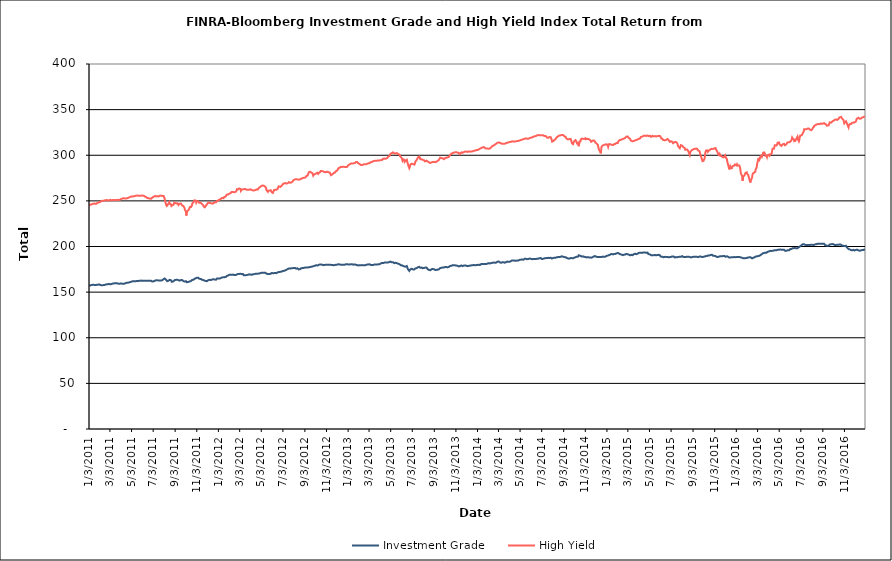
| Category | Investment Grade | High Yield |
|---|---|---|
| 1/3/11 | 157.626 | 244.716 |
| 1/4/11 | 157.815 | 245.187 |
| 1/5/11 | 157.257 | 245.618 |
| 1/6/11 | 157.308 | 245.993 |
| 1/7/11 | 157.728 | 245.896 |
| 1/10/11 | 157.85 | 246.09 |
| 1/11/11 | 157.862 | 246.402 |
| 1/12/11 | 157.794 | 246.55 |
| 1/13/11 | 158.013 | 246.81 |
| 1/14/11 | 158.143 | 246.922 |
| 1/18/11 | 157.91 | 247.078 |
| 1/19/11 | 158.148 | 247.099 |
| 1/20/11 | 157.779 | 246.707 |
| 1/21/11 | 157.772 | 246.716 |
| 1/24/11 | 157.98 | 246.961 |
| 1/25/11 | 158.258 | 247.578 |
| 1/26/11 | 158.002 | 247.765 |
| 1/27/11 | 158.085 | 248.289 |
| 1/28/11 | 158.333 | 247.918 |
| 1/31/11 | 158.463 | 248.319 |
| 2/1/11 | 158.167 | 248.646 |
| 2/2/11 | 158.091 | 248.934 |
| 2/3/11 | 157.788 | 248.813 |
| 2/4/11 | 157.483 | 249.293 |
| 2/7/11 | 157.584 | 249.856 |
| 2/8/11 | 157.563 | 250.164 |
| 2/9/11 | 157.528 | 250.282 |
| 2/10/11 | 157.543 | 250.22 |
| 2/11/11 | 157.651 | 250.083 |
| 2/14/11 | 157.832 | 250.194 |
| 2/15/11 | 157.905 | 250.283 |
| 2/16/11 | 157.966 | 250.519 |
| 2/17/11 | 158.084 | 250.733 |
| 2/18/11 | 158.064 | 250.911 |
| 2/22/11 | 158.645 | 250.896 |
| 2/23/11 | 158.66 | 250.602 |
| 2/24/11 | 158.475 | 250.152 |
| 2/25/11 | 158.728 | 250.286 |
| 2/28/11 | 159 | 250.537 |
| 3/1/11 | 159.151 | 250.931 |
| 3/2/11 | 159.145 | 251.083 |
| 3/3/11 | 158.534 | 251.151 |
| 3/4/11 | 158.722 | 250.995 |
| 3/7/11 | 158.888 | 250.721 |
| 3/8/11 | 158.73 | 251.313 |
| 3/9/11 | 158.992 | 251.345 |
| 3/10/11 | 159.281 | 250.84 |
| 3/11/11 | 159.453 | 250.74 |
| 3/14/11 | 159.639 | 250.996 |
| 3/15/11 | 159.696 | 250.261 |
| 3/16/11 | 160.006 | 250.243 |
| 3/17/11 | 159.744 | 250.739 |
| 3/18/11 | 159.878 | 251.393 |
| 3/21/11 | 159.836 | 251.043 |
| 3/22/11 | 159.827 | 251.203 |
| 3/23/11 | 159.71 | 250.998 |
| 3/24/11 | 159.495 | 251.104 |
| 3/25/11 | 159.317 | 250.991 |
| 3/28/11 | 159.199 | 251.006 |
| 3/29/11 | 159.016 | 251.066 |
| 3/30/11 | 159.023 | 251.431 |
| 3/31/11 | 159.304 | 251.272 |
| 4/1/11 | 159.072 | 251.92 |
| 4/4/11 | 159.53 | 252.238 |
| 4/5/11 | 159.285 | 252.698 |
| 4/6/11 | 159.11 | 252.56 |
| 4/7/11 | 159.049 | 252.574 |
| 4/8/11 | 159.041 | 252.811 |
| 4/11/11 | 159.06 | 252.995 |
| 4/12/11 | 159.391 | 252.709 |
| 4/13/11 | 159.584 | 252.682 |
| 4/14/11 | 159.56 | 252.554 |
| 4/15/11 | 159.954 | 252.893 |
| 4/18/11 | 160.215 | 252.622 |
| 4/19/11 | 160.381 | 252.671 |
| 4/20/11 | 160.362 | 252.88 |
| 4/21/11 | 160.327 | 253.09 |
| 4/25/11 | 160.449 | 253.534 |
| 4/26/11 | 160.774 | 253.773 |
| 4/27/11 | 160.593 | 253.724 |
| 4/28/11 | 160.972 | 254.275 |
| 4/29/11 | 161.184 | 254.364 |
| 5/2/11 | 161.378 | 254.711 |
| 5/3/11 | 161.544 | 254.53 |
| 5/4/11 | 161.69 | 254.875 |
| 5/5/11 | 161.863 | 254.808 |
| 5/6/11 | 161.867 | 255.155 |
| 5/9/11 | 162.019 | 255.013 |
| 5/10/11 | 161.844 | 255.551 |
| 5/11/11 | 161.91 | 255.621 |
| 5/12/11 | 161.919 | 255.348 |
| 5/13/11 | 162.003 | 255.328 |
| 5/16/11 | 162.092 | 255.735 |
| 5/17/11 | 162.436 | 255.698 |
| 5/18/11 | 162.239 | 255.708 |
| 5/19/11 | 162.04 | 255.887 |
| 5/20/11 | 162.161 | 255.759 |
| 5/23/11 | 162.38 | 255.548 |
| 5/24/11 | 162.266 | 255.706 |
| 5/25/11 | 162.212 | 255.594 |
| 5/26/11 | 162.355 | 255.674 |
| 5/27/11 | 162.427 | 256.036 |
| 5/31/11 | 162.634 | 255.76 |
| 6/1/11 | 162.928 | 255.849 |
| 6/2/11 | 162.566 | 255.591 |
| 6/3/11 | 162.489 | 255.756 |
| 6/6/11 | 162.453 | 255.667 |
| 6/7/11 | 162.401 | 255.356 |
| 6/8/11 | 162.584 | 254.91 |
| 6/9/11 | 162.504 | 254.704 |
| 6/10/11 | 162.479 | 254.634 |
| 6/13/11 | 162.452 | 254.118 |
| 6/14/11 | 162.032 | 253.948 |
| 6/15/11 | 162.272 | 253.687 |
| 6/16/11 | 162.422 | 253.138 |
| 6/17/11 | 162.412 | 253.373 |
| 6/20/11 | 162.37 | 252.794 |
| 6/21/11 | 162.429 | 252.839 |
| 6/22/11 | 162.449 | 253.214 |
| 6/23/11 | 162.527 | 252.527 |
| 6/24/11 | 162.699 | 252.693 |
| 6/27/11 | 162.361 | 252.368 |
| 6/28/11 | 161.852 | 253.028 |
| 6/29/11 | 161.652 | 253.4 |
| 6/30/11 | 161.582 | 253.619 |
| 7/1/11 | 161.664 | 254.51 |
| 7/5/11 | 162.021 | 254.798 |
| 7/6/11 | 162.135 | 255.008 |
| 7/7/11 | 161.984 | 255.276 |
| 7/8/11 | 162.646 | 255.417 |
| 7/11/11 | 162.928 | 254.826 |
| 7/12/11 | 163.078 | 254.68 |
| 7/13/11 | 163.147 | 255.054 |
| 7/14/11 | 162.932 | 255.182 |
| 7/15/11 | 162.894 | 254.981 |
| 7/18/11 | 162.779 | 254.861 |
| 7/19/11 | 162.716 | 254.905 |
| 7/20/11 | 162.937 | 255.359 |
| 7/21/11 | 162.64 | 255.583 |
| 7/22/11 | 162.835 | 255.706 |
| 7/25/11 | 162.739 | 255.818 |
| 7/26/11 | 162.87 | 256.239 |
| 7/27/11 | 162.9 | 255.731 |
| 7/28/11 | 162.985 | 255.399 |
| 7/29/11 | 163.627 | 255.056 |
| 8/1/11 | 164.219 | 255.393 |
| 8/2/11 | 164.63 | 254.416 |
| 8/3/11 | 164.773 | 253.433 |
| 8/4/11 | 164.945 | 252.108 |
| 8/5/11 | 164.443 | 251.097 |
| 8/8/11 | 163.395 | 245.602 |
| 8/9/11 | 163.141 | 244.507 |
| 8/10/11 | 163.204 | 244.486 |
| 8/11/11 | 161.985 | 243.45 |
| 8/12/11 | 162.398 | 245.222 |
| 8/15/11 | 162.572 | 247.051 |
| 8/16/11 | 162.936 | 247.363 |
| 8/17/11 | 163.319 | 248.419 |
| 8/18/11 | 163.44 | 246.821 |
| 8/19/11 | 163.205 | 246.281 |
| 8/22/11 | 162.937 | 246.179 |
| 8/23/11 | 162.18 | 244.365 |
| 8/24/11 | 161.334 | 243.738 |
| 8/25/11 | 161.636 | 244.871 |
| 8/26/11 | 161.888 | 245.33 |
| 8/29/11 | 161.931 | 245.795 |
| 8/30/11 | 162.637 | 246.122 |
| 8/31/11 | 162.878 | 248.155 |
| 9/1/11 | 163.171 | 248.397 |
| 9/2/11 | 163.433 | 248.749 |
| 9/6/11 | 163.525 | 247.181 |
| 9/7/11 | 163.501 | 247.704 |
| 9/8/11 | 163.55 | 247.68 |
| 9/9/11 | 163.455 | 247.331 |
| 9/12/11 | 163.134 | 245.486 |
| 9/13/11 | 162.81 | 245.818 |
| 9/14/11 | 162.872 | 246.767 |
| 9/15/11 | 162.604 | 247.229 |
| 9/16/11 | 162.758 | 247.457 |
| 9/19/11 | 163.176 | 247.147 |
| 9/20/11 | 163.198 | 247.421 |
| 9/21/11 | 163.313 | 247.136 |
| 9/22/11 | 163.267 | 245.042 |
| 9/23/11 | 162.556 | 244.18 |
| 9/26/11 | 162.073 | 244.218 |
| 9/27/11 | 161.715 | 244.546 |
| 9/28/11 | 161.525 | 243.141 |
| 9/29/11 | 161.625 | 242.219 |
| 9/30/11 | 161.689 | 240.219 |
| 10/3/11 | 162.004 | 238.38 |
| 10/4/11 | 161.143 | 233.908 |
| 10/5/11 | 160.886 | 235.671 |
| 10/6/11 | 160.951 | 238.602 |
| 10/7/11 | 160.961 | 239.592 |
| 10/10/11 | 161.166 | 239.899 |
| 10/11/11 | 160.928 | 238.887 |
| 10/12/11 | 161.23 | 241 |
| 10/13/11 | 161.659 | 241.617 |
| 10/14/11 | 161.731 | 243.19 |
| 10/17/11 | 162.158 | 243.24 |
| 10/18/11 | 162.533 | 243.056 |
| 10/19/11 | 163.006 | 244.34 |
| 10/20/11 | 163.27 | 245.545 |
| 10/21/11 | 163.339 | 247.234 |
| 10/24/11 | 163.572 | 248.376 |
| 10/25/11 | 164.328 | 248.912 |
| 10/26/11 | 164.52 | 248.238 |
| 10/27/11 | 164.511 | 250.561 |
| 10/28/11 | 164.72 | 250.417 |
| 10/31/11 | 165.306 | 250.216 |
| 11/1/11 | 165.588 | 248.202 |
| 11/2/11 | 165.878 | 248.888 |
| 11/3/11 | 165.715 | 249.704 |
| 11/4/11 | 165.525 | 249.34 |
| 11/7/11 | 165.647 | 249.362 |
| 11/8/11 | 165.175 | 249.684 |
| 11/9/11 | 164.87 | 247.965 |
| 11/10/11 | 164.546 | 248.191 |
| 11/11/11 | 164.675 | 248.388 |
| 11/14/11 | 164.476 | 247.916 |
| 11/15/11 | 164.016 | 247.289 |
| 11/16/11 | 164.031 | 246.969 |
| 11/17/11 | 163.585 | 246.641 |
| 11/18/11 | 163.519 | 246.23 |
| 11/21/11 | 163.224 | 245.092 |
| 11/22/11 | 162.875 | 243.879 |
| 11/23/11 | 162.664 | 243.793 |
| 11/25/11 | 162.461 | 242.969 |
| 11/28/11 | 162.222 | 244.54 |
| 11/29/11 | 162.156 | 243.804 |
| 11/30/11 | 162.163 | 244.618 |
| 12/1/11 | 161.972 | 246.167 |
| 12/2/11 | 162.826 | 247.051 |
| 12/5/11 | 163.133 | 248.137 |
| 12/6/11 | 163.241 | 248.226 |
| 12/7/11 | 163.212 | 247.919 |
| 12/8/11 | 163.503 | 247.823 |
| 12/9/11 | 163.137 | 247.71 |
| 12/12/11 | 163.2 | 247.591 |
| 12/13/11 | 163.288 | 247.331 |
| 12/14/11 | 163.464 | 246.905 |
| 12/15/11 | 163.704 | 247.047 |
| 12/16/11 | 164.017 | 247.285 |
| 12/19/11 | 164.19 | 247.198 |
| 12/20/11 | 163.925 | 247.708 |
| 12/21/11 | 163.789 | 247.851 |
| 12/22/11 | 163.874 | 248.444 |
| 12/23/11 | 163.706 | 248.74 |
| 12/27/11 | 163.62 | 248.467 |
| 12/28/11 | 164.409 | 249.294 |
| 12/29/11 | 164.65 | 249.693 |
| 12/30/11 | 165.028 | 249.97 |
| 1/3/12 | 165 | 250.715 |
| 1/4/12 | 164.79 | 250.779 |
| 1/5/12 | 164.735 | 251.086 |
| 1/6/12 | 164.96 | 251.448 |
| 1/9/12 | 165.268 | 251.961 |
| 1/10/12 | 165.441 | 252.742 |
| 1/11/12 | 165.803 | 252.832 |
| 1/12/12 | 166.032 | 253.184 |
| 1/13/12 | 166.183 | 253.02 |
| 1/17/12 | 166.274 | 252.866 |
| 1/18/12 | 166.444 | 253.06 |
| 1/19/12 | 166.456 | 254.263 |
| 1/20/12 | 166.437 | 254.397 |
| 1/23/12 | 166.529 | 254.743 |
| 1/24/12 | 166.417 | 254.88 |
| 1/25/12 | 166.929 | 255.446 |
| 1/26/12 | 167.686 | 256.822 |
| 1/27/12 | 167.976 | 256.959 |
| 1/30/12 | 168.315 | 257.005 |
| 1/31/12 | 168.58 | 256.808 |
| 2/1/12 | 168.573 | 257.523 |
| 2/2/12 | 168.91 | 257.778 |
| 2/3/12 | 168.745 | 257.951 |
| 2/6/12 | 169.019 | 258.538 |
| 2/7/12 | 168.872 | 258.607 |
| 2/8/12 | 169.153 | 259.455 |
| 2/9/12 | 168.938 | 259.817 |
| 2/10/12 | 169.066 | 259.132 |
| 2/13/12 | 169.249 | 259.743 |
| 2/14/12 | 169.29 | 259.486 |
| 2/15/12 | 169.329 | 259.581 |
| 2/16/12 | 168.702 | 259.357 |
| 2/17/12 | 168.808 | 260.074 |
| 2/21/12 | 168.807 | 260.076 |
| 2/22/12 | 169.006 | 260.884 |
| 2/23/12 | 169.182 | 261.495 |
| 2/24/12 | 169.517 | 262.8 |
| 2/27/12 | 169.832 | 262.498 |
| 2/28/12 | 170.084 | 262.863 |
| 2/29/12 | 170.208 | 263.462 |
| 3/1/12 | 169.958 | 263.656 |
| 3/2/12 | 170.404 | 263.482 |
| 3/5/12 | 170.096 | 262.963 |
| 3/6/12 | 169.911 | 260.954 |
| 3/7/12 | 169.867 | 261.475 |
| 3/8/12 | 169.702 | 261.711 |
| 3/9/12 | 169.585 | 262.512 |
| 3/12/12 | 169.759 | 262.676 |
| 3/13/12 | 169.338 | 262.921 |
| 3/14/12 | 168.604 | 263.168 |
| 3/15/12 | 168.553 | 262.878 |
| 3/16/12 | 168.639 | 262.992 |
| 3/19/12 | 168.542 | 262.878 |
| 3/20/12 | 168.348 | 262.477 |
| 3/21/12 | 168.765 | 262.877 |
| 3/22/12 | 168.674 | 262.254 |
| 3/23/12 | 168.965 | 262.017 |
| 3/26/12 | 169.026 | 262.319 |
| 3/27/12 | 169.446 | 262.573 |
| 3/28/12 | 169.432 | 262.566 |
| 3/29/12 | 169.464 | 262.104 |
| 3/30/12 | 169.412 | 262.581 |
| 4/2/12 | 169.408 | 262.705 |
| 4/3/12 | 169.271 | 262.827 |
| 4/4/12 | 168.83 | 262.433 |
| 4/5/12 | 168.956 | 262 |
| 4/9/12 | 169.563 | 261.491 |
| 4/10/12 | 169.66 | 260.789 |
| 4/11/12 | 169.504 | 260.797 |
| 4/12/12 | 169.575 | 261.504 |
| 4/13/12 | 169.893 | 261.894 |
| 4/16/12 | 170.079 | 261.862 |
| 4/17/12 | 169.995 | 262.478 |
| 4/18/12 | 170.068 | 262.661 |
| 4/19/12 | 170.194 | 262.593 |
| 4/20/12 | 170.075 | 262.792 |
| 4/23/12 | 170.258 | 262.506 |
| 4/24/12 | 170.151 | 263.114 |
| 4/25/12 | 170.052 | 263.997 |
| 4/26/12 | 170.32 | 264.193 |
| 4/27/12 | 170.504 | 264.573 |
| 4/30/12 | 170.798 | 265.38 |
| 5/1/12 | 170.791 | 266.079 |
| 5/2/12 | 171.05 | 266.388 |
| 5/3/12 | 171.183 | 266.464 |
| 5/4/12 | 171.332 | 266.529 |
| 5/7/12 | 171.284 | 266.86 |
| 5/8/12 | 171.473 | 266.486 |
| 5/9/12 | 171.253 | 266.124 |
| 5/10/12 | 171.161 | 266.473 |
| 5/11/12 | 171.321 | 266.48 |
| 5/14/12 | 171.318 | 265.403 |
| 5/15/12 | 171.144 | 265.259 |
| 5/16/12 | 170.604 | 264.152 |
| 5/17/12 | 170.27 | 261.717 |
| 5/18/12 | 169.962 | 260.994 |
| 5/21/12 | 169.887 | 259.995 |
| 5/22/12 | 169.745 | 261.241 |
| 5/23/12 | 169.888 | 260.549 |
| 5/24/12 | 169.74 | 260.698 |
| 5/25/12 | 169.974 | 261.09 |
| 5/29/12 | 170.104 | 261.678 |
| 5/30/12 | 170.523 | 261.215 |
| 5/31/12 | 170.894 | 260.94 |
| 6/1/12 | 171.018 | 259.478 |
| 6/4/12 | 170.775 | 258.736 |
| 6/5/12 | 170.482 | 258.384 |
| 6/6/12 | 170.426 | 260.187 |
| 6/7/12 | 170.775 | 261.74 |
| 6/8/12 | 170.965 | 261.457 |
| 6/11/12 | 171.032 | 262.151 |
| 6/12/12 | 170.646 | 261.8 |
| 6/13/12 | 170.807 | 262.045 |
| 6/14/12 | 170.791 | 262.064 |
| 6/15/12 | 171.482 | 262.908 |
| 6/18/12 | 171.637 | 263.399 |
| 6/19/12 | 171.659 | 264.743 |
| 6/20/12 | 171.768 | 265.827 |
| 6/21/12 | 172.115 | 265.94 |
| 6/22/12 | 172.025 | 265.728 |
| 6/25/12 | 172.199 | 265.279 |
| 6/26/12 | 172.058 | 265.524 |
| 6/27/12 | 172.152 | 265.968 |
| 6/28/12 | 172.304 | 266.213 |
| 6/29/12 | 172.257 | 267.309 |
| 7/2/12 | 173.09 | 268.096 |
| 7/3/12 | 173.221 | 268.752 |
| 7/5/12 | 173.316 | 269.146 |
| 7/6/12 | 173.56 | 269.538 |
| 7/9/12 | 173.833 | 269.493 |
| 7/10/12 | 174.086 | 269.579 |
| 7/11/12 | 174.259 | 269.722 |
| 7/12/12 | 174.453 | 269.04 |
| 7/13/12 | 174.699 | 269.154 |
| 7/16/12 | 175.24 | 269.239 |
| 7/17/12 | 175.328 | 269.334 |
| 7/18/12 | 175.845 | 269.69 |
| 7/19/12 | 175.973 | 270.505 |
| 7/20/12 | 175.936 | 270.235 |
| 7/23/12 | 175.822 | 269.894 |
| 7/24/12 | 176.004 | 269.604 |
| 7/25/12 | 176.025 | 269.406 |
| 7/26/12 | 176.118 | 270.041 |
| 7/27/12 | 175.687 | 270.63 |
| 7/30/12 | 176.107 | 271.303 |
| 7/31/12 | 176.44 | 272.05 |
| 8/1/12 | 176.338 | 272.672 |
| 8/2/12 | 176.512 | 272.465 |
| 8/3/12 | 176.119 | 272.799 |
| 8/6/12 | 176.532 | 273.572 |
| 8/7/12 | 176.104 | 274.005 |
| 8/8/12 | 175.944 | 273.748 |
| 8/9/12 | 175.686 | 273.786 |
| 8/10/12 | 176.002 | 273.401 |
| 8/13/12 | 176.09 | 273.532 |
| 8/14/12 | 175.65 | 273.594 |
| 8/15/12 | 175.071 | 273.101 |
| 8/16/12 | 174.906 | 273.147 |
| 8/17/12 | 174.987 | 273.072 |
| 8/20/12 | 175.143 | 273.57 |
| 8/21/12 | 175.21 | 274.034 |
| 8/22/12 | 175.778 | 274.203 |
| 8/23/12 | 176.169 | 274.362 |
| 8/24/12 | 176.127 | 274.551 |
| 8/27/12 | 176.358 | 274.825 |
| 8/28/12 | 176.454 | 275.031 |
| 8/29/12 | 176.284 | 274.914 |
| 8/30/12 | 176.477 | 275.32 |
| 8/31/12 | 176.81 | 275.392 |
| 9/4/12 | 177.032 | 275.567 |
| 9/5/12 | 176.91 | 275.631 |
| 9/6/12 | 176.68 | 276.312 |
| 9/7/12 | 177.103 | 277.344 |
| 9/10/12 | 177.002 | 277.72 |
| 9/11/12 | 177.098 | 278.556 |
| 9/12/12 | 177.05 | 279.736 |
| 9/13/12 | 177.212 | 280.396 |
| 9/14/12 | 177.169 | 281.535 |
| 9/17/12 | 177.454 | 281.887 |
| 9/18/12 | 177.646 | 281.586 |
| 9/19/12 | 177.912 | 281.618 |
| 9/20/12 | 177.78 | 281.149 |
| 9/21/12 | 177.838 | 281.063 |
| 9/24/12 | 178.1 | 280.276 |
| 9/25/12 | 178.087 | 279.718 |
| 9/26/12 | 178.216 | 277.714 |
| 9/27/12 | 178.469 | 278.535 |
| 9/28/12 | 178.688 | 278.908 |
| 10/1/12 | 178.975 | 279.276 |
| 10/2/12 | 179.149 | 279.208 |
| 10/3/12 | 179.331 | 279.587 |
| 10/4/12 | 179.471 | 279.992 |
| 10/5/12 | 179.287 | 280.375 |
| 10/8/12 | 179.17 | 280.811 |
| 10/9/12 | 179.42 | 280.214 |
| 10/10/12 | 179.403 | 279.596 |
| 10/11/12 | 179.787 | 280.444 |
| 10/12/12 | 180.286 | 280.729 |
| 10/15/12 | 180.386 | 281.353 |
| 10/16/12 | 180.411 | 281.917 |
| 10/17/12 | 180.427 | 282.705 |
| 10/18/12 | 180.252 | 282.93 |
| 10/19/12 | 180.181 | 282.592 |
| 10/22/12 | 179.984 | 282.579 |
| 10/23/12 | 179.808 | 281.491 |
| 10/24/12 | 179.787 | 281.88 |
| 10/25/12 | 179.532 | 282.013 |
| 10/26/12 | 179.776 | 281.343 |
| 10/29/12 | 179.874 | 281.464 |
| 10/30/12 | 179.896 | 281.521 |
| 10/31/12 | 180.158 | 281.409 |
| 11/1/12 | 180.105 | 281.505 |
| 11/2/12 | 180.019 | 281.845 |
| 11/5/12 | 180.13 | 282.006 |
| 11/6/12 | 179.794 | 282.389 |
| 11/7/12 | 179.95 | 281.412 |
| 11/8/12 | 180.011 | 281.342 |
| 11/9/12 | 179.956 | 280.712 |
| 11/12/12 | 179.993 | 281.011 |
| 11/13/12 | 180.036 | 279.914 |
| 11/14/12 | 180.015 | 279.447 |
| 11/15/12 | 179.863 | 278.145 |
| 11/16/12 | 179.799 | 277.878 |
| 11/19/12 | 179.795 | 279.127 |
| 11/20/12 | 179.615 | 279.948 |
| 11/21/12 | 179.343 | 280.164 |
| 11/23/12 | 179.415 | 280.637 |
| 11/26/12 | 179.727 | 280.898 |
| 11/27/12 | 179.835 | 281.598 |
| 11/28/12 | 179.951 | 281.767 |
| 11/29/12 | 179.975 | 282.593 |
| 11/30/12 | 180.118 | 283.394 |
| 12/3/12 | 180.152 | 283.319 |
| 12/4/12 | 180.225 | 283.828 |
| 12/5/12 | 180.496 | 284.899 |
| 12/6/12 | 180.562 | 285.395 |
| 12/7/12 | 180.315 | 286.027 |
| 12/10/12 | 180.348 | 286.385 |
| 12/11/12 | 180.223 | 286.768 |
| 12/12/12 | 180.123 | 287.14 |
| 12/13/12 | 179.907 | 287.331 |
| 12/14/12 | 180.071 | 287.179 |
| 12/17/12 | 179.933 | 287.169 |
| 12/18/12 | 179.627 | 287.436 |
| 12/19/12 | 179.934 | 287.562 |
| 12/20/12 | 179.999 | 287.474 |
| 12/21/12 | 180.203 | 286.963 |
| 12/24/12 | 180.079 | 287.133 |
| 12/26/12 | 180.197 | 286.749 |
| 12/27/12 | 180.542 | 287.091 |
| 12/28/12 | 180.711 | 287.206 |
| 12/31/12 | 180.615 | 287.373 |
| 1/2/13 | 180.418 | 288.714 |
| 1/3/13 | 180.314 | 289.229 |
| 1/4/13 | 180.218 | 289.691 |
| 1/7/13 | 180.416 | 290.115 |
| 1/8/13 | 180.534 | 290.229 |
| 1/9/13 | 180.497 | 290.492 |
| 1/10/13 | 180.403 | 290.811 |
| 1/11/13 | 180.366 | 291.068 |
| 1/14/13 | 180.474 | 290.972 |
| 1/15/13 | 180.457 | 290.556 |
| 1/16/13 | 180.451 | 290.825 |
| 1/17/13 | 180.126 | 291.101 |
| 1/18/13 | 180.262 | 291.424 |
| 1/22/13 | 180.359 | 291.542 |
| 1/23/13 | 180.414 | 291.942 |
| 1/24/13 | 180.258 | 292.239 |
| 1/25/13 | 179.88 | 292.639 |
| 1/28/13 | 179.528 | 292.699 |
| 1/29/13 | 179.475 | 291.968 |
| 1/30/13 | 179.216 | 291.435 |
| 1/31/13 | 179.282 | 290.547 |
| 2/1/13 | 179.319 | 290.795 |
| 2/4/13 | 179.396 | 290.328 |
| 2/5/13 | 179.186 | 289.927 |
| 2/6/13 | 179.33 | 289.626 |
| 2/7/13 | 179.53 | 289.348 |
| 2/8/13 | 179.424 | 289.123 |
| 2/11/13 | 179.601 | 289.312 |
| 2/12/13 | 179.432 | 289.517 |
| 2/13/13 | 179.276 | 289.685 |
| 2/14/13 | 179.47 | 289.903 |
| 2/15/13 | 179.428 | 289.938 |
| 2/19/13 | 179.436 | 290.138 |
| 2/20/13 | 179.393 | 290.311 |
| 2/21/13 | 179.67 | 289.894 |
| 2/22/13 | 179.791 | 290.126 |
| 2/25/13 | 180.195 | 290.674 |
| 2/26/13 | 180.36 | 290.49 |
| 2/27/13 | 180.275 | 290.647 |
| 2/28/13 | 180.295 | 291.129 |
| 3/1/13 | 180.498 | 291.056 |
| 3/4/13 | 180.547 | 291.371 |
| 3/5/13 | 180.405 | 292.183 |
| 3/6/13 | 180.162 | 292.263 |
| 3/7/13 | 179.864 | 292.342 |
| 3/8/13 | 179.491 | 292.364 |
| 3/11/13 | 179.561 | 292.71 |
| 3/12/13 | 179.833 | 292.986 |
| 3/13/13 | 179.763 | 292.997 |
| 3/14/13 | 179.781 | 293.521 |
| 3/15/13 | 180.017 | 293.66 |
| 3/18/13 | 180.309 | 293.843 |
| 3/19/13 | 180.56 | 293.925 |
| 3/20/13 | 180.234 | 294.009 |
| 3/21/13 | 180.19 | 293.882 |
| 3/22/13 | 180.169 | 293.97 |
| 3/25/13 | 180.202 | 294.027 |
| 3/26/13 | 180.105 | 293.998 |
| 3/27/13 | 180.419 | 294.128 |
| 3/28/13 | 180.443 | 294.272 |
| 4/1/13 | 180.531 | 294.371 |
| 4/2/13 | 180.461 | 294.579 |
| 4/3/13 | 180.789 | 294.607 |
| 4/4/13 | 181.285 | 294.648 |
| 4/5/13 | 181.945 | 294.632 |
| 4/8/13 | 182.004 | 294.735 |
| 4/9/13 | 182.049 | 295.329 |
| 4/10/13 | 181.764 | 295.607 |
| 4/11/13 | 181.777 | 296.149 |
| 4/12/13 | 182.134 | 296.506 |
| 4/15/13 | 182.382 | 296.343 |
| 4/16/13 | 182.309 | 296.556 |
| 4/17/13 | 182.364 | 296.241 |
| 4/18/13 | 182.416 | 296.14 |
| 4/19/13 | 182.332 | 296.394 |
| 4/22/13 | 182.498 | 296.78 |
| 4/23/13 | 182.612 | 297.392 |
| 4/24/13 | 182.699 | 297.751 |
| 4/25/13 | 182.517 | 298.19 |
| 4/26/13 | 182.907 | 298.71 |
| 4/29/13 | 183.005 | 299.268 |
| 4/30/13 | 183.021 | 300.067 |
| 5/1/13 | 183.331 | 300.856 |
| 5/2/13 | 183.461 | 301.386 |
| 5/3/13 | 182.88 | 301.968 |
| 5/6/13 | 182.703 | 302.267 |
| 5/7/13 | 182.682 | 302.749 |
| 5/8/13 | 182.755 | 303.216 |
| 5/9/13 | 182.747 | 303.174 |
| 5/10/13 | 182.048 | 302.716 |
| 5/13/13 | 181.775 | 302.027 |
| 5/14/13 | 181.74 | 301.767 |
| 5/15/13 | 181.725 | 301.705 |
| 5/16/13 | 182.182 | 302.013 |
| 5/17/13 | 181.879 | 302.136 |
| 5/20/13 | 181.74 | 302.424 |
| 5/21/13 | 181.831 | 302.406 |
| 5/22/13 | 181.51 | 302.291 |
| 5/23/13 | 181.254 | 301.321 |
| 5/24/13 | 181.269 | 300.988 |
| 5/28/13 | 180.478 | 300.573 |
| 5/29/13 | 179.983 | 298.941 |
| 5/30/13 | 179.917 | 298.874 |
| 5/31/13 | 179.394 | 298.159 |
| 6/3/13 | 179.454 | 296.868 |
| 6/4/13 | 179.162 | 296.146 |
| 6/5/13 | 178.829 | 293.959 |
| 6/6/13 | 178.861 | 293.342 |
| 6/7/13 | 178.695 | 295.478 |
| 6/10/13 | 178.13 | 295.107 |
| 6/11/13 | 177.577 | 292.825 |
| 6/12/13 | 177.663 | 293.39 |
| 6/13/13 | 177.842 | 292.841 |
| 6/14/13 | 178.613 | 294.18 |
| 6/17/13 | 178.554 | 295.091 |
| 6/18/13 | 178.04 | 294.81 |
| 6/19/13 | 177.631 | 294.581 |
| 6/20/13 | 175.366 | 290.384 |
| 6/21/13 | 174.752 | 289.646 |
| 6/24/13 | 173.249 | 285.828 |
| 6/25/13 | 173.543 | 286.221 |
| 6/26/13 | 174.232 | 287.65 |
| 6/27/13 | 174.959 | 289.73 |
| 6/28/13 | 175.137 | 290.228 |
| 7/1/13 | 175.576 | 290.788 |
| 7/2/13 | 175.941 | 291.105 |
| 7/3/13 | 175.988 | 290.585 |
| 7/5/13 | 174.738 | 290.273 |
| 7/8/13 | 174.822 | 289.667 |
| 7/9/13 | 175.184 | 290.346 |
| 7/10/13 | 175.151 | 290.844 |
| 7/11/13 | 175.898 | 292.926 |
| 7/12/13 | 176.14 | 293.609 |
| 7/15/13 | 176.351 | 294.919 |
| 7/16/13 | 176.666 | 295.47 |
| 7/17/13 | 177.121 | 296.161 |
| 7/18/13 | 177.12 | 297.519 |
| 7/19/13 | 177.42 | 297.862 |
| 7/22/13 | 177.769 | 298.556 |
| 7/23/13 | 177.698 | 298.585 |
| 7/24/13 | 176.991 | 297.183 |
| 7/25/13 | 176.669 | 295.729 |
| 7/26/13 | 177.005 | 295.673 |
| 7/29/13 | 176.886 | 295.5 |
| 7/30/13 | 176.857 | 295.631 |
| 7/31/13 | 176.508 | 295.054 |
| 8/1/13 | 176.191 | 295.026 |
| 8/2/13 | 176.666 | 294.693 |
| 8/5/13 | 176.529 | 294.436 |
| 8/6/13 | 176.451 | 293.84 |
| 8/7/13 | 176.654 | 293.33 |
| 8/8/13 | 176.91 | 293.6 |
| 8/9/13 | 176.889 | 293.805 |
| 8/12/13 | 176.834 | 294.05 |
| 8/13/13 | 176.01 | 293.634 |
| 8/14/13 | 175.868 | 293.796 |
| 8/15/13 | 175.063 | 293.112 |
| 8/16/13 | 174.752 | 292.875 |
| 8/19/13 | 174.276 | 292.095 |
| 8/20/13 | 174.561 | 291.862 |
| 8/21/13 | 174.282 | 291.78 |
| 8/22/13 | 173.987 | 291.473 |
| 8/23/13 | 174.557 | 291.996 |
| 8/26/13 | 175.088 | 292.307 |
| 8/27/13 | 175.55 | 292.162 |
| 8/28/13 | 175.33 | 292.241 |
| 8/29/13 | 175.469 | 292.563 |
| 8/30/13 | 175.752 | 293.08 |
| 9/3/13 | 174.857 | 292.778 |
| 9/4/13 | 174.803 | 292.764 |
| 9/5/13 | 173.839 | 292.314 |
| 9/6/13 | 174.212 | 292.438 |
| 9/9/13 | 174.432 | 293.107 |
| 9/10/13 | 174.027 | 293 |
| 9/11/13 | 174.23 | 293.246 |
| 9/12/13 | 174.624 | 293.821 |
| 9/13/13 | 174.528 | 294.088 |
| 9/16/13 | 175.136 | 295.082 |
| 9/17/13 | 175.056 | 295.217 |
| 9/18/13 | 175.426 | 295.876 |
| 9/19/13 | 176.394 | 297.362 |
| 9/20/13 | 176.442 | 297.438 |
| 9/23/13 | 176.64 | 296.94 |
| 9/24/13 | 177.073 | 297.042 |
| 9/25/13 | 177.29 | 296.788 |
| 9/26/13 | 177.116 | 296.649 |
| 9/27/13 | 177.17 | 296.298 |
| 9/30/13 | 177.029 | 295.684 |
| 10/1/13 | 177.035 | 296.078 |
| 10/2/13 | 177.315 | 296.334 |
| 10/3/13 | 177.535 | 296.928 |
| 10/4/13 | 177.247 | 297.16 |
| 10/7/13 | 177.419 | 297.396 |
| 10/8/13 | 177.369 | 297.091 |
| 10/9/13 | 177.218 | 296.983 |
| 10/10/13 | 177.152 | 297.583 |
| 10/11/13 | 177.569 | 298.016 |
| 10/14/13 | 177.705 | 298.362 |
| 10/15/13 | 177.422 | 298.46 |
| 10/16/13 | 177.683 | 299.078 |
| 10/17/13 | 178.623 | 300.339 |
| 10/18/13 | 179.055 | 301.275 |
| 10/21/13 | 178.946 | 301.75 |
| 10/22/13 | 179.5 | 302.295 |
| 10/23/13 | 179.642 | 302.152 |
| 10/24/13 | 179.451 | 302.314 |
| 10/25/13 | 179.509 | 302.45 |
| 10/28/13 | 179.497 | 302.947 |
| 10/29/13 | 179.506 | 303.014 |
| 10/30/13 | 179.7 | 303.179 |
| 10/31/13 | 179.418 | 303.199 |
| 11/1/13 | 179.055 | 302.946 |
| 11/4/13 | 179.086 | 303.346 |
| 11/5/13 | 178.619 | 302.838 |
| 11/6/13 | 178.743 | 302.912 |
| 11/7/13 | 178.912 | 302.935 |
| 11/8/13 | 178.027 | 302.168 |
| 11/11/13 | 178.148 | 302.481 |
| 11/12/13 | 177.732 | 301.574 |
| 11/13/13 | 178.044 | 301.25 |
| 11/14/13 | 178.581 | 301.928 |
| 11/15/13 | 178.699 | 302.34 |
| 11/18/13 | 179.216 | 303.154 |
| 11/19/13 | 179.056 | 303.064 |
| 11/20/13 | 178.763 | 302.951 |
| 11/21/13 | 178.483 | 302.637 |
| 11/22/13 | 178.866 | 303.162 |
| 11/25/13 | 179.18 | 303.49 |
| 11/26/13 | 179.447 | 303.451 |
| 11/27/13 | 179.295 | 303.964 |
| 11/29/13 | 179.243 | 304.187 |
| 12/2/13 | 178.936 | 303.959 |
| 12/3/13 | 179.077 | 304.022 |
| 12/4/13 | 178.638 | 303.759 |
| 12/5/13 | 178.482 | 303.661 |
| 12/6/13 | 178.524 | 303.958 |
| 12/9/13 | 178.794 | 304.229 |
| 12/10/13 | 179.26 | 304.454 |
| 12/11/13 | 179.244 | 304.384 |
| 12/12/13 | 178.971 | 303.923 |
| 12/13/13 | 179.064 | 304.033 |
| 12/16/13 | 179.328 | 304.232 |
| 12/17/13 | 179.548 | 304.208 |
| 12/18/13 | 179.531 | 304.127 |
| 12/19/13 | 179.415 | 304.237 |
| 12/20/13 | 179.659 | 304.524 |
| 12/23/13 | 179.774 | 304.868 |
| 12/24/13 | 179.596 | 304.866 |
| 12/26/13 | 179.421 | 304.99 |
| 12/27/13 | 179.346 | 305.23 |
| 12/30/13 | 179.619 | 305.626 |
| 12/31/13 | 179.735 | 305.727 |
| 1/2/14 | 179.728 | 305.662 |
| 1/3/14 | 179.753 | 305.864 |
| 1/6/14 | 180.039 | 306.408 |
| 1/7/14 | 180.116 | 306.94 |
| 1/8/14 | 179.579 | 306.969 |
| 1/9/14 | 179.671 | 307.098 |
| 1/10/14 | 180.4 | 307.505 |
| 1/13/14 | 180.811 | 307.909 |
| 1/14/14 | 180.596 | 307.963 |
| 1/15/14 | 180.41 | 308.397 |
| 1/16/14 | 180.672 | 308.499 |
| 1/17/14 | 180.742 | 308.963 |
| 1/21/14 | 180.804 | 308.937 |
| 1/22/14 | 180.542 | 309.084 |
| 1/23/14 | 180.718 | 308.76 |
| 1/24/14 | 180.846 | 307.697 |
| 1/27/14 | 180.803 | 307.291 |
| 1/28/14 | 180.86 | 307.421 |
| 1/29/14 | 181.147 | 307.34 |
| 1/30/14 | 181.221 | 307.5 |
| 1/31/14 | 181.355 | 307.291 |
| 2/3/14 | 181.763 | 307.131 |
| 2/4/14 | 181.689 | 307.001 |
| 2/5/14 | 181.423 | 306.844 |
| 2/6/14 | 181.395 | 307.294 |
| 2/7/14 | 181.768 | 308.141 |
| 2/10/14 | 181.871 | 308.736 |
| 2/11/14 | 181.686 | 309.108 |
| 2/12/14 | 181.564 | 309.671 |
| 2/13/14 | 182.068 | 309.957 |
| 2/14/14 | 182.2 | 310.47 |
| 2/18/14 | 182.466 | 310.993 |
| 2/19/14 | 182.465 | 311.258 |
| 2/20/14 | 182.013 | 311.434 |
| 2/21/14 | 182.187 | 311.855 |
| 2/24/14 | 182.309 | 312.532 |
| 2/25/14 | 182.786 | 313.061 |
| 2/26/14 | 182.966 | 313.386 |
| 2/27/14 | 183.242 | 313.688 |
| 2/28/14 | 183.242 | 313.95 |
| 3/3/14 | 183.617 | 313.958 |
| 3/4/14 | 183.201 | 314.086 |
| 3/5/14 | 183.098 | 314.146 |
| 3/6/14 | 182.707 | 313.68 |
| 3/7/14 | 182.162 | 313.23 |
| 3/10/14 | 182.161 | 312.94 |
| 3/11/14 | 182.18 | 312.996 |
| 3/12/14 | 182.373 | 312.805 |
| 3/13/14 | 182.68 | 312.601 |
| 3/14/14 | 182.791 | 312.17 |
| 3/17/14 | 182.764 | 312.694 |
| 3/18/14 | 182.841 | 312.994 |
| 3/19/14 | 182.684 | 313.321 |
| 3/20/14 | 182.283 | 312.665 |
| 3/21/14 | 182.579 | 313.2 |
| 3/24/14 | 182.821 | 313.213 |
| 3/25/14 | 182.966 | 313.327 |
| 3/26/14 | 183.239 | 313.866 |
| 3/27/14 | 183.453 | 313.624 |
| 3/28/14 | 183.28 | 313.939 |
| 3/31/14 | 183.295 | 314.186 |
| 4/1/14 | 183.326 | 314.175 |
| 4/2/14 | 182.944 | 314.368 |
| 4/3/14 | 183.181 | 314.462 |
| 4/4/14 | 183.667 | 314.772 |
| 4/7/14 | 184.06 | 314.72 |
| 4/8/14 | 184.138 | 314.878 |
| 4/9/14 | 184.201 | 315.146 |
| 4/10/14 | 184.696 | 315.282 |
| 4/11/14 | 184.791 | 314.863 |
| 4/14/14 | 184.777 | 315.029 |
| 4/15/14 | 184.821 | 314.902 |
| 4/16/14 | 184.74 | 315.02 |
| 4/17/14 | 184.509 | 315.085 |
| 4/21/14 | 184.449 | 315.235 |
| 4/22/14 | 184.345 | 315.366 |
| 4/23/14 | 184.609 | 315.544 |
| 4/24/14 | 184.557 | 315.604 |
| 4/25/14 | 184.79 | 315.711 |
| 4/28/14 | 184.686 | 315.777 |
| 4/29/14 | 184.555 | 315.908 |
| 4/30/14 | 184.879 | 316.245 |
| 5/1/14 | 185.332 | 316.202 |
| 5/2/14 | 185.496 | 316.636 |
| 5/5/14 | 185.588 | 316.655 |
| 5/6/14 | 185.606 | 316.793 |
| 5/7/14 | 185.64 | 316.933 |
| 5/8/14 | 185.782 | 317.079 |
| 5/9/14 | 185.695 | 317.384 |
| 5/12/14 | 185.477 | 317.601 |
| 5/13/14 | 185.77 | 317.893 |
| 5/14/14 | 186.391 | 318.157 |
| 5/15/14 | 186.658 | 318.079 |
| 5/16/14 | 186.536 | 318.037 |
| 5/19/14 | 186.535 | 318.482 |
| 5/20/14 | 186.465 | 318.324 |
| 5/21/14 | 186.201 | 318.324 |
| 5/22/14 | 186.056 | 318.13 |
| 5/23/14 | 186.327 | 318.26 |
| 5/27/14 | 186.419 | 318.216 |
| 5/28/14 | 187.106 | 318.396 |
| 5/29/14 | 187.185 | 318.6 |
| 5/30/14 | 186.936 | 318.99 |
| 6/2/14 | 186.525 | 319.196 |
| 6/3/14 | 186.096 | 318.824 |
| 6/4/14 | 185.923 | 318.923 |
| 6/5/14 | 186.096 | 319.519 |
| 6/6/14 | 186.357 | 319.906 |
| 6/9/14 | 186.269 | 320.267 |
| 6/10/14 | 186.071 | 320.527 |
| 6/11/14 | 186.117 | 320.701 |
| 6/12/14 | 186.209 | 320.732 |
| 6/13/14 | 186.298 | 320.741 |
| 6/16/14 | 186.394 | 321.02 |
| 6/17/14 | 186.061 | 320.916 |
| 6/18/14 | 186.227 | 321.023 |
| 6/19/14 | 186.477 | 321.712 |
| 6/20/14 | 186.358 | 321.828 |
| 6/23/14 | 186.687 | 322.129 |
| 6/24/14 | 186.768 | 322.229 |
| 6/25/14 | 187.112 | 322.061 |
| 6/26/14 | 187.237 | 321.92 |
| 6/27/14 | 187.246 | 321.907 |
| 6/30/14 | 187.28 | 321.988 |
| 7/1/14 | 186.985 | 321.994 |
| 7/2/14 | 186.597 | 321.974 |
| 7/3/14 | 186.327 | 321.934 |
| 7/7/14 | 186.526 | 321.932 |
| 7/8/14 | 186.93 | 321.735 |
| 7/9/14 | 186.875 | 321.432 |
| 7/10/14 | 187.101 | 320.961 |
| 7/11/14 | 187.261 | 320.984 |
| 7/14/14 | 187.168 | 320.983 |
| 7/15/14 | 187.05 | 320.744 |
| 7/16/14 | 187.124 | 320.402 |
| 7/17/14 | 187.478 | 319.546 |
| 7/18/14 | 187.415 | 319.119 |
| 7/21/14 | 187.552 | 319.067 |
| 7/22/14 | 187.59 | 319.413 |
| 7/23/14 | 187.802 | 320.013 |
| 7/24/14 | 187.45 | 320.044 |
| 7/25/14 | 187.698 | 320.029 |
| 7/28/14 | 187.674 | 319.769 |
| 7/29/14 | 187.837 | 319.656 |
| 7/30/14 | 187.301 | 319.047 |
| 7/31/14 | 186.886 | 316.528 |
| 8/1/14 | 187.092 | 314.942 |
| 8/4/14 | 187.413 | 315.476 |
| 8/5/14 | 187.252 | 316.358 |
| 8/6/14 | 187.363 | 316.277 |
| 8/7/14 | 187.673 | 316.579 |
| 8/8/14 | 187.896 | 316.826 |
| 8/11/14 | 187.77 | 317.856 |
| 8/12/14 | 187.676 | 318.383 |
| 8/13/14 | 187.876 | 319.344 |
| 8/14/14 | 188.161 | 319.663 |
| 8/15/14 | 188.62 | 319.986 |
| 8/18/14 | 188.479 | 320.831 |
| 8/19/14 | 188.396 | 321.336 |
| 8/20/14 | 188.206 | 321.492 |
| 8/21/14 | 188.347 | 321.61 |
| 8/22/14 | 188.447 | 321.622 |
| 8/25/14 | 188.701 | 321.818 |
| 8/26/14 | 188.792 | 322.093 |
| 8/27/14 | 188.959 | 322.039 |
| 8/28/14 | 189.247 | 322.212 |
| 8/29/14 | 189.332 | 322.307 |
| 9/2/14 | 188.727 | 321.963 |
| 9/3/14 | 188.618 | 321.632 |
| 9/4/14 | 188.349 | 321.109 |
| 9/5/14 | 188.346 | 320.463 |
| 9/8/14 | 188.284 | 320.285 |
| 9/9/14 | 187.806 | 319.5 |
| 9/10/14 | 187.427 | 318.374 |
| 9/11/14 | 187.429 | 317.872 |
| 9/12/14 | 186.837 | 317.625 |
| 9/15/14 | 186.884 | 317.32 |
| 9/16/14 | 186.942 | 316.989 |
| 9/17/14 | 186.928 | 317.395 |
| 9/18/14 | 186.65 | 317.716 |
| 9/19/14 | 186.954 | 318.104 |
| 9/22/14 | 187.276 | 317.886 |
| 9/23/14 | 187.426 | 316.785 |
| 9/24/14 | 187.209 | 316.242 |
| 9/25/14 | 187.279 | 314.369 |
| 9/26/14 | 186.843 | 313.067 |
| 9/29/14 | 187.044 | 312.227 |
| 9/30/14 | 187.078 | 313.839 |
| 10/1/14 | 187.741 | 314.5 |
| 10/2/14 | 187.805 | 314.68 |
| 10/3/14 | 187.775 | 315.764 |
| 10/6/14 | 188.229 | 316.652 |
| 10/7/14 | 188.613 | 315.906 |
| 10/8/14 | 188.736 | 315.449 |
| 10/9/14 | 188.86 | 314.322 |
| 10/10/14 | 188.827 | 312.945 |
| 10/13/14 | 188.921 | 313.229 |
| 10/14/14 | 189.474 | 311.473 |
| 10/15/14 | 190.361 | 309.937 |
| 10/16/14 | 189.617 | 311.032 |
| 10/17/14 | 189.527 | 315.087 |
| 10/20/14 | 189.692 | 315.391 |
| 10/21/14 | 189.622 | 317.481 |
| 10/22/14 | 189.473 | 317.828 |
| 10/23/14 | 189.056 | 318.169 |
| 10/24/14 | 189.113 | 318.268 |
| 10/27/14 | 189.192 | 317.999 |
| 10/28/14 | 189.053 | 318.308 |
| 10/29/14 | 188.673 | 318.003 |
| 10/30/14 | 188.788 | 317.85 |
| 10/31/14 | 188.531 | 318.489 |
| 11/3/14 | 188.389 | 318.666 |
| 11/4/14 | 188.42 | 317.568 |
| 11/5/14 | 188.206 | 317.764 |
| 11/6/14 | 188.056 | 317.831 |
| 11/7/14 | 188.309 | 317.73 |
| 11/10/14 | 188.303 | 318.028 |
| 11/11/14 | 188.337 | 318.366 |
| 11/12/14 | 188.151 | 317.973 |
| 11/13/14 | 188.062 | 317.544 |
| 11/14/14 | 188.002 | 316.97 |
| 11/17/14 | 187.855 | 316.264 |
| 11/18/14 | 187.783 | 315.504 |
| 11/19/14 | 187.533 | 314.749 |
| 11/20/14 | 187.762 | 314.823 |
| 11/21/14 | 188.187 | 315.646 |
| 11/24/14 | 188.506 | 316.096 |
| 11/25/14 | 188.832 | 316.289 |
| 11/26/14 | 189.221 | 316.481 |
| 11/28/14 | 189.453 | 316.019 |
| 12/1/14 | 189.339 | 313.923 |
| 12/2/14 | 188.594 | 312.837 |
| 12/3/14 | 188.505 | 313.025 |
| 12/4/14 | 188.701 | 312.974 |
| 12/5/14 | 188.301 | 312.533 |
| 12/8/14 | 188.448 | 311.404 |
| 12/9/14 | 188.664 | 309.375 |
| 12/10/14 | 188.681 | 307.796 |
| 12/11/14 | 188.559 | 307.125 |
| 12/12/14 | 188.929 | 305.319 |
| 12/15/14 | 188.561 | 303.76 |
| 12/16/14 | 188.411 | 302.104 |
| 12/17/14 | 188.632 | 304.814 |
| 12/18/14 | 188.376 | 308.594 |
| 12/19/14 | 188.733 | 309.774 |
| 12/22/14 | 188.996 | 310.688 |
| 12/23/14 | 188.785 | 311.246 |
| 12/24/14 | 188.507 | 311.397 |
| 12/26/14 | 188.632 | 311.433 |
| 12/29/14 | 188.966 | 311.834 |
| 12/30/14 | 189.326 | 311.52 |
| 12/31/14 | 189.333 | 311.585 |
| 1/2/15 | 189.707 | 311.981 |
| 1/5/15 | 190.061 | 310.514 |
| 1/6/15 | 190.617 | 309.236 |
| 1/7/15 | 190.665 | 310.323 |
| 1/8/15 | 190.51 | 312.032 |
| 1/9/15 | 190.821 | 312.279 |
| 1/12/15 | 191.135 | 312.116 |
| 1/13/15 | 191.197 | 311.828 |
| 1/14/15 | 191.521 | 311.162 |
| 1/15/15 | 191.841 | 311.605 |
| 1/16/15 | 191.445 | 311.391 |
| 1/20/15 | 191.389 | 311.144 |
| 1/21/15 | 191.221 | 311.199 |
| 1/22/15 | 191.103 | 311.857 |
| 1/23/15 | 191.851 | 312.326 |
| 1/26/15 | 191.9 | 312.417 |
| 1/27/15 | 192.1 | 312.884 |
| 1/28/15 | 192.361 | 313.314 |
| 1/29/15 | 192.305 | 313.305 |
| 1/30/15 | 192.95 | 313.334 |
| 2/2/15 | 192.968 | 313.318 |
| 2/3/15 | 192.453 | 314.525 |
| 2/4/15 | 192.202 | 315.219 |
| 2/5/15 | 192.42 | 315.883 |
| 2/6/15 | 191.635 | 316.843 |
| 2/9/15 | 191.513 | 316.93 |
| 2/10/15 | 191.119 | 317.059 |
| 2/11/15 | 191.011 | 316.766 |
| 2/12/15 | 191.228 | 316.948 |
| 2/13/15 | 191.17 | 317.553 |
| 2/17/15 | 190.516 | 317.925 |
| 2/18/15 | 190.732 | 318.48 |
| 2/19/15 | 190.899 | 318.317 |
| 2/20/15 | 191.064 | 318.426 |
| 2/23/15 | 191.233 | 318.871 |
| 2/24/15 | 191.796 | 319.378 |
| 2/25/15 | 192.095 | 319.888 |
| 2/26/15 | 191.89 | 320.343 |
| 2/27/15 | 191.784 | 320.609 |
| 3/2/15 | 191.428 | 320.621 |
| 3/3/15 | 191.217 | 320.166 |
| 3/4/15 | 191.071 | 319.366 |
| 3/5/15 | 191.13 | 319.372 |
| 3/6/15 | 190.188 | 318.446 |
| 3/9/15 | 190.354 | 317.968 |
| 3/10/15 | 190.614 | 316.558 |
| 3/11/15 | 190.601 | 316.519 |
| 3/12/15 | 190.908 | 316.885 |
| 3/13/15 | 190.461 | 315.689 |
| 3/16/15 | 190.47 | 315.333 |
| 3/17/15 | 190.485 | 314.448 |
| 3/18/15 | 191.067 | 314.742 |
| 3/19/15 | 191.54 | 315.682 |
| 3/20/15 | 191.822 | 315.866 |
| 3/23/15 | 192.11 | 316.214 |
| 3/24/15 | 192.44 | 316.861 |
| 3/25/15 | 192.239 | 316.964 |
| 3/26/15 | 191.565 | 316.677 |
| 3/27/15 | 191.862 | 317.03 |
| 3/30/15 | 192.098 | 317.31 |
| 3/31/15 | 192.401 | 317.42 |
| 4/1/15 | 193.098 | 317.516 |
| 4/2/15 | 193.003 | 317.916 |
| 4/6/15 | 193.061 | 318.403 |
| 4/7/15 | 193.189 | 319.183 |
| 4/8/15 | 193.294 | 319.982 |
| 4/9/15 | 193.065 | 319.944 |
| 4/10/15 | 193.121 | 320.249 |
| 4/13/15 | 193.1 | 320.514 |
| 4/14/15 | 193.634 | 320.559 |
| 4/15/15 | 193.607 | 321.112 |
| 4/16/15 | 193.507 | 321.387 |
| 4/17/15 | 193.596 | 321.137 |
| 4/20/15 | 193.52 | 321.448 |
| 4/21/15 | 193.485 | 321.42 |
| 4/22/15 | 193.004 | 321.095 |
| 4/23/15 | 193.028 | 321.187 |
| 4/24/15 | 193.376 | 321.481 |
| 4/27/15 | 193.341 | 321.656 |
| 4/28/15 | 192.898 | 321.552 |
| 4/29/15 | 191.919 | 321.035 |
| 4/30/15 | 191.641 | 320.923 |
| 5/1/15 | 191.347 | 320.985 |
| 5/4/15 | 191.24 | 321.415 |
| 5/5/15 | 190.804 | 321.24 |
| 5/6/15 | 190.311 | 320.599 |
| 5/7/15 | 190.486 | 320.138 |
| 5/8/15 | 191.114 | 321.066 |
| 5/11/15 | 190.518 | 321.303 |
| 5/12/15 | 190.062 | 320.241 |
| 5/13/15 | 190.17 | 320.532 |
| 5/14/15 | 190.341 | 320.675 |
| 5/15/15 | 191.128 | 321.09 |
| 5/18/15 | 190.766 | 321.013 |
| 5/19/15 | 190.19 | 320.685 |
| 5/20/15 | 190.072 | 320.346 |
| 5/21/15 | 190.363 | 320.591 |
| 5/22/15 | 190.34 | 320.969 |
| 5/26/15 | 190.75 | 321.078 |
| 5/27/15 | 190.746 | 321.085 |
| 5/28/15 | 190.768 | 320.932 |
| 5/29/15 | 190.858 | 321.287 |
| 6/1/15 | 190.299 | 321.112 |
| 6/2/15 | 189.535 | 320.755 |
| 6/3/15 | 188.981 | 320.082 |
| 6/4/15 | 189.213 | 319.441 |
| 6/5/15 | 188.734 | 318.312 |
| 6/8/15 | 188.775 | 317.984 |
| 6/9/15 | 188.302 | 317.115 |
| 6/10/15 | 187.769 | 316.776 |
| 6/11/15 | 188.261 | 317.519 |
| 6/12/15 | 188.635 | 317.054 |
| 6/15/15 | 188.648 | 316.418 |
| 6/16/15 | 188.708 | 316.12 |
| 6/17/15 | 188.537 | 316.3 |
| 6/18/15 | 188.609 | 316.722 |
| 6/19/15 | 189.116 | 317.238 |
| 6/22/15 | 188.628 | 317.811 |
| 6/23/15 | 188.3 | 317.684 |
| 6/24/15 | 188.338 | 317.368 |
| 6/25/15 | 188.237 | 317.021 |
| 6/26/15 | 187.822 | 316.337 |
| 6/29/15 | 188.375 | 314.703 |
| 6/30/15 | 188.681 | 314.864 |
| 7/1/15 | 188.274 | 315.1 |
| 7/2/15 | 188.576 | 315.355 |
| 7/6/15 | 189.147 | 314.576 |
| 7/7/15 | 189.675 | 313.726 |
| 7/8/15 | 189.613 | 313.221 |
| 7/9/15 | 189.158 | 313.623 |
| 7/10/15 | 188.346 | 313.933 |
| 7/13/15 | 188.004 | 314.451 |
| 7/14/15 | 188.086 | 314.425 |
| 7/15/15 | 188.263 | 314.773 |
| 7/16/15 | 188.395 | 314.607 |
| 7/17/15 | 188.539 | 313.541 |
| 7/20/15 | 188.252 | 313.008 |
| 7/21/15 | 188.364 | 311.89 |
| 7/22/15 | 188.518 | 310.158 |
| 7/23/15 | 188.582 | 309.546 |
| 7/24/15 | 188.713 | 309.053 |
| 7/27/15 | 188.742 | 307.675 |
| 7/28/15 | 188.674 | 307.681 |
| 7/29/15 | 188.468 | 309.739 |
| 7/30/15 | 188.615 | 311.038 |
| 7/31/15 | 189.136 | 310.99 |
| 8/3/15 | 189.44 | 310.44 |
| 8/4/15 | 189.213 | 310.662 |
| 8/5/15 | 188.525 | 310.156 |
| 8/6/15 | 188.549 | 308.888 |
| 8/7/15 | 188.722 | 307.831 |
| 8/10/15 | 188.414 | 307.899 |
| 8/11/15 | 188.993 | 306.132 |
| 8/12/15 | 188.87 | 305.253 |
| 8/13/15 | 188.469 | 306.097 |
| 8/14/15 | 188.452 | 306.11 |
| 8/17/15 | 188.806 | 306.314 |
| 8/18/15 | 188.592 | 306.318 |
| 8/19/15 | 188.512 | 305.434 |
| 8/20/15 | 188.837 | 304.431 |
| 8/21/15 | 188.933 | 303.589 |
| 8/24/15 | 188.595 | 300.424 |
| 8/25/15 | 188.204 | 302.606 |
| 8/26/15 | 187.67 | 302.604 |
| 8/27/15 | 188.019 | 304.35 |
| 8/28/15 | 188.358 | 305.18 |
| 8/31/15 | 188.367 | 305.826 |
| 9/1/15 | 188.247 | 304.962 |
| 9/2/15 | 188.362 | 305.418 |
| 9/3/15 | 188.653 | 306.544 |
| 9/4/15 | 189.01 | 306.28 |
| 9/8/15 | 188.718 | 307.036 |
| 9/9/15 | 188.655 | 307.608 |
| 9/10/15 | 188.494 | 307.246 |
| 9/11/15 | 188.665 | 307.363 |
| 9/14/15 | 188.69 | 307.074 |
| 9/15/15 | 188.159 | 306.609 |
| 9/16/15 | 187.944 | 305.521 |
| 9/17/15 | 188.34 | 305.22 |
| 9/18/15 | 189.306 | 304.649 |
| 9/21/15 | 189.059 | 304.37 |
| 9/22/15 | 189.258 | 302.461 |
| 9/23/15 | 189.047 | 301.926 |
| 9/24/15 | 189.028 | 299.581 |
| 9/25/15 | 188.577 | 299.012 |
| 9/28/15 | 188.471 | 295.006 |
| 9/29/15 | 188.44 | 293.54 |
| 9/30/15 | 188.623 | 294.564 |
| 10/1/15 | 188.623 | 294.486 |
| 10/2/15 | 189.14 | 293.886 |
| 10/5/15 | 189.025 | 296.403 |
| 10/6/15 | 189.276 | 299.244 |
| 10/7/15 | 189.595 | 302.748 |
| 10/8/15 | 189.43 | 302.803 |
| 10/9/15 | 189.435 | 305.191 |
| 10/12/15 | 189.631 | 305.396 |
| 10/13/15 | 189.828 | 304.61 |
| 10/14/15 | 190.284 | 303.801 |
| 10/15/15 | 190.206 | 303.775 |
| 10/16/15 | 190.278 | 305.084 |
| 10/19/15 | 190.23 | 305.351 |
| 10/20/15 | 190.028 | 305.83 |
| 10/21/15 | 190.51 | 306.449 |
| 10/22/15 | 190.755 | 305.933 |
| 10/23/15 | 190.542 | 306.998 |
| 10/26/15 | 190.885 | 307.039 |
| 10/27/15 | 190.974 | 306.329 |
| 10/28/15 | 190.541 | 306.511 |
| 10/29/15 | 189.77 | 306.829 |
| 10/30/15 | 189.791 | 306.783 |
| 11/2/15 | 189.726 | 307.628 |
| 11/3/15 | 189.6 | 308.064 |
| 11/4/15 | 189.523 | 308.412 |
| 11/5/15 | 189.453 | 307.838 |
| 11/6/15 | 188.847 | 306.34 |
| 11/9/15 | 188.6 | 304.619 |
| 11/10/15 | 188.716 | 303.578 |
| 11/11/15 | 188.833 | 303.745 |
| 11/12/15 | 188.608 | 301.988 |
| 11/13/15 | 188.887 | 300.485 |
| 11/16/15 | 189.089 | 299.857 |
| 11/17/15 | 189.003 | 301.109 |
| 11/18/15 | 189.028 | 300.852 |
| 11/19/15 | 189.435 | 299.564 |
| 11/20/15 | 189.385 | 299.468 |
| 11/23/15 | 189.322 | 298.54 |
| 11/24/15 | 189.411 | 297.716 |
| 11/25/15 | 189.478 | 297.794 |
| 11/27/15 | 189.585 | 297.664 |
| 11/30/15 | 189.558 | 298.227 |
| 12/1/15 | 190.086 | 299.118 |
| 12/2/15 | 189.953 | 299.72 |
| 12/3/15 | 188.758 | 298.59 |
| 12/4/15 | 188.919 | 297.419 |
| 12/7/15 | 189.292 | 295.635 |
| 12/8/15 | 188.972 | 293.107 |
| 12/9/15 | 188.913 | 293.184 |
| 12/10/15 | 188.785 | 292.429 |
| 12/11/15 | 188.792 | 288.532 |
| 12/14/15 | 187.841 | 284.516 |
| 12/15/15 | 187.577 | 286.934 |
| 12/16/15 | 187.538 | 288.067 |
| 12/17/15 | 187.998 | 288.032 |
| 12/18/15 | 188.195 | 285.949 |
| 12/21/15 | 188.295 | 285.827 |
| 12/22/15 | 188.067 | 286.645 |
| 12/23/15 | 188.046 | 288.156 |
| 12/24/15 | 188.194 | 288.68 |
| 12/28/15 | 188.439 | 288.682 |
| 12/29/15 | 188.099 | 289.708 |
| 12/30/15 | 188.072 | 289.923 |
| 12/31/15 | 188.32 | 289.896 |
| 1/4/16 | 188.381 | 288.66 |
| 1/5/16 | 188.267 | 290.104 |
| 1/6/16 | 188.652 | 290.134 |
| 1/7/16 | 188.566 | 288.992 |
| 1/8/16 | 188.818 | 289.452 |
| 1/11/16 | 188.546 | 288.696 |
| 1/12/16 | 188.571 | 287.678 |
| 1/13/16 | 188.602 | 286.344 |
| 1/14/16 | 188.152 | 284.133 |
| 1/15/16 | 188.039 | 280.669 |
| 1/19/16 | 187.614 | 276.856 |
| 1/20/16 | 187.117 | 271.948 |
| 1/21/16 | 187.26 | 273.375 |
| 1/22/16 | 187.182 | 276.914 |
| 1/25/16 | 187.235 | 277.728 |
| 1/26/16 | 187.33 | 278.532 |
| 1/27/16 | 187.065 | 279.194 |
| 1/28/16 | 187.241 | 280.568 |
| 1/29/16 | 187.696 | 281.653 |
| 2/1/16 | 187.417 | 281.298 |
| 2/2/16 | 187.72 | 279.608 |
| 2/3/16 | 187.721 | 279.031 |
| 2/4/16 | 187.855 | 279.454 |
| 2/5/16 | 187.886 | 278.382 |
| 2/8/16 | 188.148 | 274.268 |
| 2/9/16 | 187.944 | 272.672 |
| 2/10/16 | 188.182 | 273.675 |
| 2/11/16 | 188.283 | 270.177 |
| 2/12/16 | 187.702 | 271.91 |
| 2/16/16 | 186.961 | 275.607 |
| 2/17/16 | 186.847 | 278.251 |
| 2/18/16 | 187.58 | 279.907 |
| 2/19/16 | 187.713 | 279.41 |
| 2/22/16 | 187.953 | 281.109 |
| 2/23/16 | 188.213 | 280.94 |
| 2/24/16 | 188.406 | 280.202 |
| 2/25/16 | 188.768 | 281.875 |
| 2/26/16 | 188.719 | 284.35 |
| 2/29/16 | 189.189 | 286.89 |
| 3/1/16 | 188.954 | 289.916 |
| 3/2/16 | 188.963 | 291.934 |
| 3/3/16 | 189.401 | 293.172 |
| 3/4/16 | 189.416 | 295.577 |
| 3/7/16 | 189.744 | 296.71 |
| 3/8/16 | 190.57 | 295.553 |
| 3/9/16 | 190.293 | 295.25 |
| 3/10/16 | 190.409 | 296.174 |
| 3/11/16 | 190.761 | 298.865 |
| 3/14/16 | 191.479 | 299.801 |
| 3/15/16 | 191.537 | 298.659 |
| 3/16/16 | 191.56 | 298.253 |
| 3/17/16 | 192.446 | 300.505 |
| 3/18/16 | 192.907 | 302.641 |
| 3/21/16 | 192.959 | 303.17 |
| 3/22/16 | 192.997 | 302.638 |
| 3/23/16 | 193.28 | 301.871 |
| 3/24/16 | 193.171 | 299.546 |
| 3/28/16 | 193.245 | 299.154 |
| 3/29/16 | 193.563 | 298.043 |
| 3/30/16 | 193.762 | 299.745 |
| 3/31/16 | 194.254 | 300.469 |
| 4/1/16 | 194.406 | 300.46 |
| 4/4/16 | 194.67 | 300.708 |
| 4/5/16 | 195.008 | 299.556 |
| 4/6/16 | 194.822 | 300.513 |
| 4/7/16 | 195.213 | 300.205 |
| 4/8/16 | 195.153 | 300.789 |
| 4/11/16 | 195.181 | 301.833 |
| 4/12/16 | 194.982 | 303.31 |
| 4/13/16 | 195.197 | 306.047 |
| 4/14/16 | 195.274 | 307.187 |
| 4/15/16 | 195.76 | 307.333 |
| 4/18/16 | 195.669 | 307.314 |
| 4/19/16 | 196.069 | 309.527 |
| 4/20/16 | 196.195 | 310.94 |
| 4/21/16 | 195.95 | 311.395 |
| 4/22/16 | 195.948 | 311.313 |
| 4/25/16 | 195.881 | 310.737 |
| 4/26/16 | 195.632 | 311.167 |
| 4/27/16 | 195.917 | 312.26 |
| 4/28/16 | 196.362 | 313.686 |
| 4/29/16 | 196.549 | 313.857 |
| 5/2/16 | 196.446 | 314.055 |
| 5/3/16 | 196.722 | 312.471 |
| 5/4/16 | 196.517 | 311.595 |
| 5/5/16 | 196.718 | 311.311 |
| 5/6/16 | 196.537 | 310.262 |
| 5/9/16 | 196.503 | 310.255 |
| 5/10/16 | 196.613 | 310.626 |
| 5/11/16 | 196.745 | 311.706 |
| 5/12/16 | 196.466 | 312.093 |
| 5/13/16 | 196.627 | 311.779 |
| 5/16/16 | 196.451 | 312.491 |
| 5/17/16 | 196.435 | 312.857 |
| 5/18/16 | 195.613 | 312.462 |
| 5/19/16 | 195.235 | 310.91 |
| 5/20/16 | 195.273 | 311.95 |
| 5/23/16 | 195.358 | 312.157 |
| 5/24/16 | 195.211 | 312.655 |
| 5/25/16 | 195.406 | 313.839 |
| 5/26/16 | 195.925 | 314.239 |
| 5/27/16 | 196.054 | 314.412 |
| 5/31/16 | 196.003 | 314.392 |
| 6/1/16 | 196.05 | 313.86 |
| 6/2/16 | 196.396 | 314.467 |
| 6/3/16 | 197.238 | 314.891 |
| 6/6/16 | 197.301 | 316.41 |
| 6/7/16 | 197.59 | 317.7 |
| 6/8/16 | 197.878 | 319.363 |
| 6/9/16 | 198.134 | 319.164 |
| 6/10/16 | 198.171 | 318.061 |
| 6/13/16 | 198.215 | 317.394 |
| 6/14/16 | 197.929 | 315.404 |
| 6/15/16 | 198.124 | 315.892 |
| 6/16/16 | 198.28 | 314.379 |
| 6/17/16 | 198.13 | 315.848 |
| 6/20/16 | 198.048 | 318.301 |
| 6/21/16 | 197.996 | 318.18 |
| 6/22/16 | 198.15 | 319.311 |
| 6/23/16 | 198.125 | 320.382 |
| 6/24/16 | 198.506 | 317.802 |
| 6/27/16 | 199.206 | 315.236 |
| 6/28/16 | 199.586 | 316.453 |
| 6/29/16 | 200.002 | 318.908 |
| 6/30/16 | 200.063 | 319.994 |
| 7/1/16 | 200.739 | 321.77 |
| 7/5/16 | 201.589 | 321.792 |
| 7/6/16 | 201.737 | 321.541 |
| 7/7/16 | 201.963 | 322.797 |
| 7/8/16 | 202.451 | 324.195 |
| 7/11/16 | 202.567 | 326.491 |
| 7/12/16 | 202.068 | 328.452 |
| 7/13/16 | 202.405 | 327.718 |
| 7/14/16 | 201.959 | 328.632 |
| 7/15/16 | 201.512 | 328.373 |
| 7/18/16 | 201.486 | 328.459 |
| 7/19/16 | 201.691 | 328.488 |
| 7/20/16 | 201.545 | 328.895 |
| 7/21/16 | 201.662 | 329.173 |
| 7/22/16 | 201.804 | 329.137 |
| 7/25/16 | 201.753 | 329.349 |
| 7/26/16 | 201.457 | 328.617 |
| 7/27/16 | 201.668 | 328.516 |
| 7/28/16 | 201.757 | 328.132 |
| 7/29/16 | 202.092 | 327.564 |
| 8/1/16 | 201.836 | 327.49 |
| 8/2/16 | 201.18 | 326.651 |
| 8/3/16 | 201.131 | 327.122 |
| 8/4/16 | 201.822 | 328.693 |
| 8/5/16 | 201.538 | 329.878 |
| 8/8/16 | 201.659 | 330.89 |
| 8/9/16 | 202.023 | 332.085 |
| 8/10/16 | 202.581 | 332.279 |
| 8/11/16 | 202.292 | 332.233 |
| 8/12/16 | 202.742 | 332.807 |
| 8/15/16 | 202.494 | 333.604 |
| 8/16/16 | 202.509 | 334.019 |
| 8/17/16 | 202.553 | 333.806 |
| 8/18/16 | 202.914 | 333.971 |
| 8/19/16 | 202.692 | 334.315 |
| 8/22/16 | 203.125 | 334.283 |
| 8/23/16 | 203.296 | 334.651 |
| 8/24/16 | 203.222 | 334.604 |
| 8/25/16 | 202.969 | 334.231 |
| 8/26/16 | 202.916 | 334.548 |
| 8/29/16 | 203.037 | 334.842 |
| 8/30/16 | 203.139 | 335.049 |
| 8/31/16 | 203.059 | 334.78 |
| 9/1/16 | 202.871 | 334.34 |
| 9/2/16 | 202.722 | 334.945 |
| 9/6/16 | 203.041 | 335.237 |
| 9/7/16 | 203.141 | 335.819 |
| 9/8/16 | 202.44 | 335.868 |
| 9/9/16 | 201.432 | 334.347 |
| 9/12/16 | 201.154 | 333.589 |
| 9/13/16 | 200.682 | 332.561 |
| 9/14/16 | 200.787 | 332.394 |
| 9/15/16 | 200.692 | 332.511 |
| 9/16/16 | 200.887 | 332.517 |
| 9/19/16 | 200.964 | 332.846 |
| 9/20/16 | 201.207 | 332.872 |
| 9/21/16 | 201.226 | 333.856 |
| 9/22/16 | 202.184 | 336.064 |
| 9/23/16 | 202.326 | 335.949 |
| 9/26/16 | 202.455 | 335.719 |
| 9/27/16 | 202.606 | 335.487 |
| 9/28/16 | 202.756 | 336.34 |
| 9/29/16 | 202.701 | 337.009 |
| 9/30/16 | 202.541 | 337.519 |
| 10/3/16 | 202.4 | 337.882 |
| 10/4/16 | 202.001 | 338.121 |
| 10/5/16 | 201.601 | 338.475 |
| 10/6/16 | 201.602 | 338.772 |
| 10/7/16 | 201.662 | 338.989 |
| 10/10/16 | 201.736 | 339.286 |
| 10/11/16 | 201.522 | 339.134 |
| 10/12/16 | 201.442 | 339.132 |
| 10/13/16 | 201.856 | 338.688 |
| 10/14/16 | 201.618 | 339.419 |
| 10/17/16 | 201.809 | 339.829 |
| 10/18/16 | 202.078 | 340.389 |
| 10/19/16 | 202.272 | 341.285 |
| 10/20/16 | 202.311 | 341.63 |
| 10/21/16 | 202.223 | 341.668 |
| 10/24/16 | 202.029 | 342.053 |
| 10/25/16 | 201.952 | 341.971 |
| 10/26/16 | 201.472 | 340.997 |
| 10/27/16 | 200.834 | 340.116 |
| 10/28/16 | 200.697 | 339.489 |
| 10/31/16 | 200.748 | 338.526 |
| 11/1/16 | 200.44 | 336.691 |
| 11/2/16 | 200.618 | 334.99 |
| 11/3/16 | 200.52 | 335.281 |
| 11/4/16 | 200.739 | 335.071 |
| 11/7/16 | 200.781 | 337.16 |
| 11/8/16 | 200.576 | 337.354 |
| 11/9/16 | 199.257 | 336.143 |
| 11/10/16 | 198.676 | 334.522 |
| 11/11/16 | 198.706 | 334.383 |
| 11/14/16 | 197.184 | 330.657 |
| 11/15/16 | 197.322 | 332.754 |
| 11/16/16 | 197.312 | 333.201 |
| 11/17/16 | 196.871 | 333.991 |
| 11/18/16 | 196.159 | 333.597 |
| 11/21/16 | 196.094 | 334.144 |
| 11/22/16 | 196.3 | 335.182 |
| 11/23/16 | 195.73 | 335.333 |
| 11/25/16 | 195.865 | 335.383 |
| 11/28/16 | 196.339 | 335.883 |
| 11/29/16 | 196.462 | 335.624 |
| 11/30/16 | 196.205 | 336.247 |
| 12/1/16 | 195.627 | 336.019 |
| 12/2/16 | 196.182 | 336.18 |
| 12/5/16 | 196.294 | 337.066 |
| 12/6/16 | 196.339 | 337.959 |
| 12/7/16 | 196.841 | 339.867 |
| 12/8/16 | 196.496 | 340.184 |
| 12/9/16 | 196.035 | 340.76 |
| 12/12/16 | 195.858 | 341.127 |
| 12/13/16 | 196.093 | 341.508 |
| 12/14/16 | 196.245 | 341.608 |
| 12/15/16 | 195.299 | 339.941 |
| 12/16/16 | 195.344 | 339.965 |
| 12/19/16 | 195.733 | 340.285 |
| 12/20/16 | 195.642 | 340.54 |
| 12/21/16 | 196.013 | 340.808 |
| 12/22/16 | 196.046 | 341.289 |
| 12/23/16 | 196.227 | 341.732 |
| 12/27/16 | 196.231 | 341.945 |
| 12/28/16 | 196.591 | 342.601 |
| 12/29/16 | 197.164 | 342.93 |
| 12/30/16 | 197.407 | 342.84 |